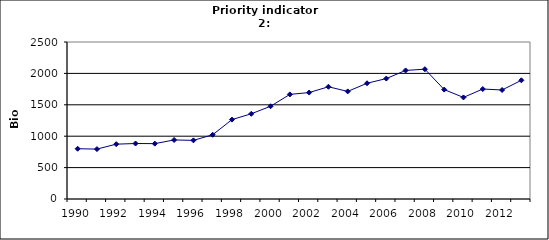
| Category | GDP, Bio Euro (EC95) |
|---|---|
| 1990 | 800.18 |
| 1991 | 794.696 |
| 1992 | 873.292 |
| 1993 | 883.601 |
| 1994 | 881.671 |
| 1995 | 940.197 |
| 1996 | 933.77 |
| 1997 | 1022.622 |
| 1998 | 1264.427 |
| 1999 | 1356.964 |
| 2000 | 1476.718 |
| 2001 | 1665.567 |
| 2002 | 1694.97 |
| 2003 | 1787.035 |
| 2004 | 1713.051 |
| 2005 | 1843.144 |
| 2006 | 1917.706 |
| 2007 | 2046.995 |
| 2008 | 2067.179 |
| 2009 | 1742.317 |
| 2010 | 1617.263 |
| 2011 | 1751.161 |
| 2012 | 1735.71 |
| 2013 | 1890.133 |